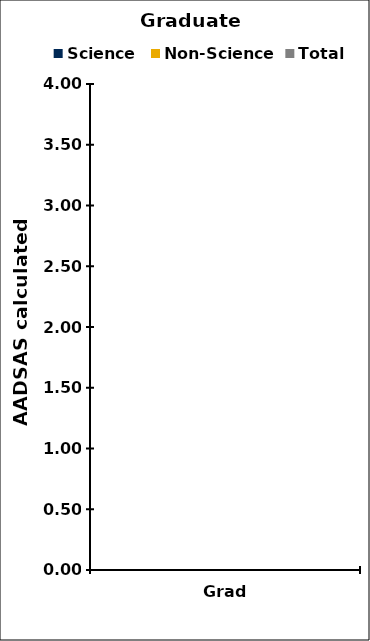
| Category | Science | Non-Science | Total |
|---|---|---|---|
| Grad | 0 | 0 | 0 |